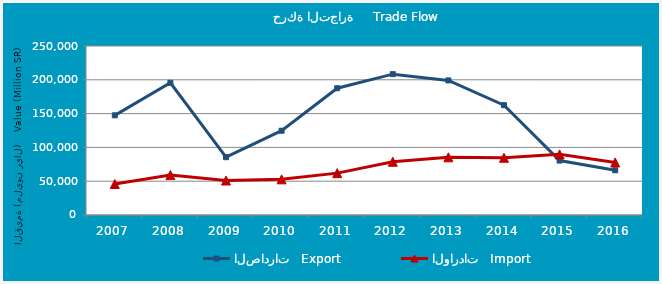
| Category | الصادرات   Export | الواردات   Import |
|---|---|---|
| 2007.0 | 147431.701 | 45852.283 |
| 2008.0 | 195520.774 | 59106.84 |
| 2009.0 | 85532.068 | 50998.881 |
| 2010.0 | 124674.705 | 52749.397 |
| 2011.0 | 187522.36 | 61943.327 |
| 2012.0 | 208338.676 | 78769.896 |
| 2013.0 | 199060.366 | 85375.665 |
| 2014.0 | 162459.718 | 84729.875 |
| 2015.0 | 80524.881 | 89678.213 |
| 2016.0 | 66128.136 | 77727.741 |